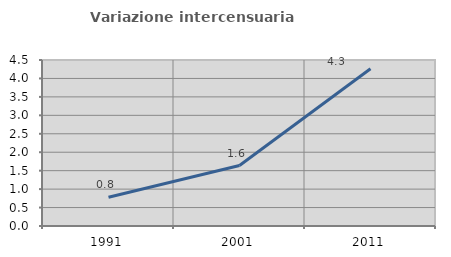
| Category | Variazione intercensuaria annua |
|---|---|
| 1991.0 | 0.78 |
| 2001.0 | 1.639 |
| 2011.0 | 4.263 |